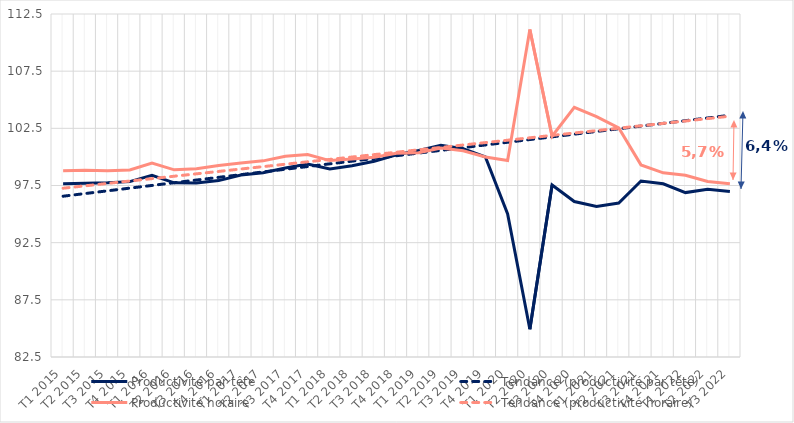
| Category | Productivité par tête | Tendance (productivité par tête) | Productivité horaire | Tendance (productivité horaire) |
|---|---|---|---|---|
| T1 2015 | 97.655 | 96.563 | 98.783 | 97.262 |
| T2 2015 | 97.691 | 96.799 | 98.826 | 97.472 |
| T3 2015 | 97.733 | 97.035 | 98.798 | 97.682 |
| T4 2015 | 97.839 | 97.271 | 98.851 | 97.892 |
| T1 2016 | 98.381 | 97.507 | 99.467 | 98.102 |
| T2 2016 | 97.736 | 97.743 | 98.87 | 98.312 |
| T3 2016 | 97.72 | 97.979 | 98.956 | 98.522 |
| T4 2016 | 97.928 | 98.215 | 99.24 | 98.732 |
| T1 2017 | 98.413 | 98.451 | 99.463 | 98.942 |
| T2 2017 | 98.623 | 98.687 | 99.656 | 99.152 |
| T3 2017 | 99.038 | 98.923 | 100.066 | 99.362 |
| T4 2017 | 99.381 | 99.159 | 100.205 | 99.572 |
| T1 2018 | 98.945 | 99.395 | 99.68 | 99.782 |
| T2 2018 | 99.223 | 99.631 | 99.822 | 99.992 |
| T3 2018 | 99.615 | 99.867 | 99.974 | 100.202 |
| T4 2018 | 100.183 | 100.103 | 100.329 | 100.412 |
| T1 2019 | 100.57 | 100.339 | 100.373 | 100.622 |
| T2 2019 | 101.027 | 100.575 | 100.783 | 100.832 |
| T3 2019 | 100.726 | 100.811 | 100.535 | 101.042 |
| T4 2019 | 100 | 101.047 | 100 | 101.252 |
| T1 2020 | 95.004 | 101.283 | 99.682 | 101.462 |
| T2 2020 | 84.926 | 101.519 | 111.15 | 101.672 |
| T3 2020 | 97.55 | 101.755 | 101.808 | 101.882 |
| T4 2020 | 96.102 | 101.991 | 104.331 | 102.092 |
| T1 2021 | 95.661 | 102.227 | 103.528 | 102.302 |
| T2 2021 | 95.966 | 102.463 | 102.53 | 102.512 |
| T3 2021 | 97.89 | 102.699 | 99.302 | 102.722 |
| T4 2021 | 97.648 | 102.935 | 98.609 | 102.932 |
| T1 2022 | 96.88 | 103.171 | 98.401 | 103.142 |
| T2 2022 | 97.161 | 103.407 | 97.848 | 103.352 |
| T3 2022 | 96.979 | 103.643 | 97.645 | 103.562 |